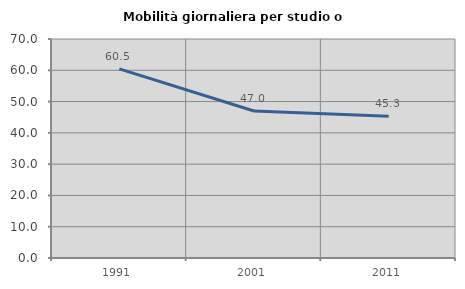
| Category | Mobilità giornaliera per studio o lavoro |
|---|---|
| 1991.0 | 60.461 |
| 2001.0 | 46.996 |
| 2011.0 | 45.318 |